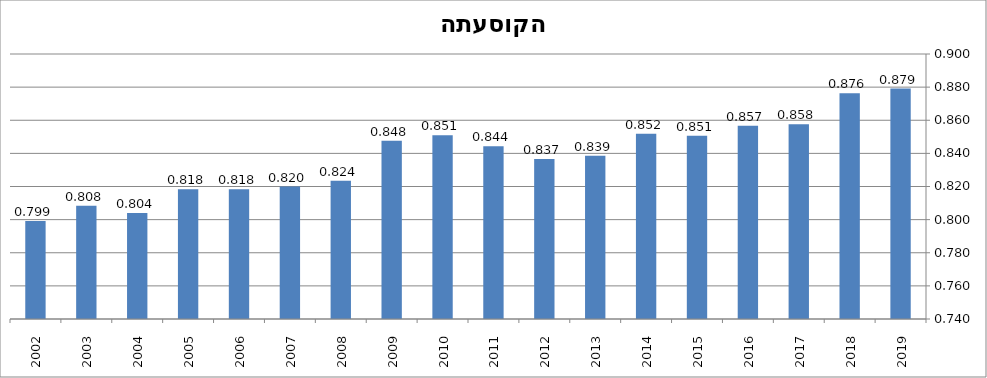
| Category | שיעור התעסוקה |
|---|---|
| 2019.0 | 0.879 |
| 2018.0 | 0.876 |
| 2017.0 | 0.858 |
| 2016.0 | 0.857 |
| 2015.0 | 0.851 |
| 2014.0 | 0.852 |
| 2013.0 | 0.839 |
| 2012.0 | 0.837 |
| 2011.0 | 0.844 |
| 2010.0 | 0.851 |
| 2009.0 | 0.848 |
| 2008.0 | 0.824 |
| 2007.0 | 0.82 |
| 2006.0 | 0.818 |
| 2005.0 | 0.818 |
| 2004.0 | 0.804 |
| 2003.0 | 0.808 |
| 2002.0 | 0.799 |